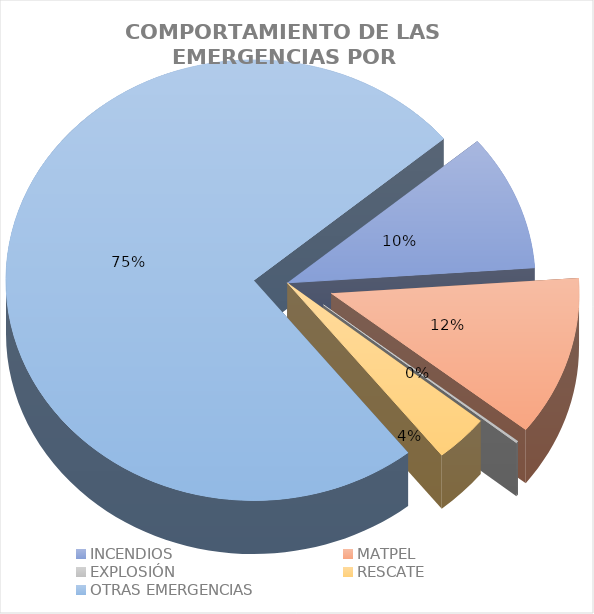
| Category | Incidentes |
|---|---|
| INCENDIOS | 0.1 |
| MATPEL | 0.117 |
| EXPLOSIÓN | 0.001 |
| RESCATE | 0.035 |
| OTRAS EMERGENCIAS | 0.746 |